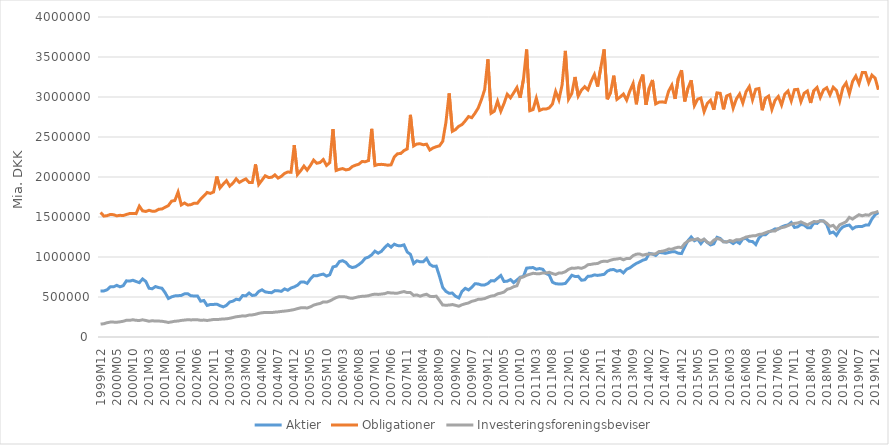
| Category | Aktier | Obligationer | Investeringsforeningsbeviser |
|---|---|---|---|
| 1999M12 | 575174 | 1557344 | 160748 |
| 2000M01 | 575647 | 1511391 | 165778 |
| 2000M02 | 590162 | 1516681 | 178351 |
| 2000M03 | 627205 | 1531792 | 186450 |
| 2000M04 | 627098 | 1528959 | 185941 |
| 2000M05 | 645738 | 1514125 | 184746 |
| 2000M06 | 627336 | 1521104 | 189451 |
| 2000M07 | 641242 | 1517881 | 196711 |
| 2000M08 | 702030 | 1531576 | 209725 |
| 2000M09 | 698497 | 1543590 | 208058 |
| 2000M10 | 709608 | 1545110 | 215514 |
| 2000M11 | 693340 | 1542126 | 208436 |
| 2000M12 | 679721 | 1635693 | 206347 |
| 2001M01 | 725587 | 1576917 | 214998 |
| 2001M02 | 694857 | 1569066 | 206745 |
| 2001M03 | 609401 | 1583968 | 196955 |
| 2001M04 | 603191 | 1572117 | 203492 |
| 2001M05 | 630929 | 1573534 | 198988 |
| 2001M06 | 617507 | 1596730 | 199211 |
| 2001M07 | 609553 | 1600137 | 196654 |
| 2001M08 | 553257 | 1622133 | 190230 |
| 2001M09 | 481246 | 1642834 | 181861 |
| 2001M10 | 501680 | 1698473 | 188909 |
| 2001M11 | 513948 | 1705760 | 196822 |
| 2001M12 | 516411 | 1811508 | 199644 |
| 2002M01 | 519822 | 1650899 | 207163 |
| 2002M02 | 539138 | 1675130 | 211558 |
| 2002M03 | 541132 | 1649367 | 216023 |
| 2002M04 | 514315 | 1654759 | 213580 |
| 2002M05 | 513817 | 1672767 | 215308 |
| 2002M06 | 513817 | 1672767 | 215308 |
| 2002M07 | 447539 | 1723382 | 208760 |
| 2002M08 | 456303 | 1762651 | 211579 |
| 2002M09 | 394395 | 1806730 | 206568 |
| 2002M10 | 406663 | 1795063 | 212548 |
| 2002M11 | 407258 | 1812469 | 219093 |
| 2002M12 | 410511 | 2006227 | 217309 |
| 2003M01 | 391549 | 1863047 | 221673 |
| 2003M02 | 376802 | 1911051 | 225702 |
| 2003M03 | 395690 | 1954134 | 227024 |
| 2003M04 | 437489 | 1886932 | 234152 |
| 2003M05 | 448094 | 1922970 | 242874 |
| 2003M06 | 472372 | 1977111 | 253018 |
| 2003M07 | 464487 | 1932479 | 257571 |
| 2003M08 | 518497 | 1955701 | 264121 |
| 2003M09 | 514394 | 1976613 | 263728 |
| 2003M10 | 549719 | 1932259 | 274176 |
| 2003M11 | 518793 | 1930731 | 276357 |
| 2003M12 | 524264 | 2157438 | 283847 |
| 2004M01 | 569517 | 1907331 | 295540 |
| 2004M02 | 590348 | 1960377 | 302996 |
| 2004M03 | 563873 | 2015258 | 306728 |
| 2004M04 | 557087 | 1994459 | 304884 |
| 2004M05 | 553644 | 1995813 | 305509 |
| 2004M06 | 579982 | 2026560 | 310671 |
| 2004M07 | 577582 | 1986508 | 314125 |
| 2004M08 | 570687 | 2008771 | 319660 |
| 2004M09 | 601262 | 2044870 | 323707 |
| 2004M10 | 584594 | 2062475 | 328383 |
| 2004M11 | 612471 | 2058625 | 335384 |
| 2004M12 | 626287 | 2399007 | 343144 |
| 2005M01 | 647568 | 2030789 | 354733 |
| 2005M02 | 686066 | 2079000 | 364640 |
| 2005M03 | 688607 | 2136473 | 366253 |
| 2005M04 | 670048 | 2086332 | 362498 |
| 2005M05 | 725046 | 2143882 | 376826 |
| 2005M06 | 767618 | 2211582 | 397766 |
| 2005M07 | 764645 | 2171839 | 410469 |
| 2005M08 | 777319 | 2181082 | 418972 |
| 2005M09 | 786332 | 2218467 | 438329 |
| 2005M10 | 761261 | 2144434 | 436105 |
| 2005M11 | 777998 | 2179472 | 450288 |
| 2005M12 | 876163 | 2599662 | 471850 |
| 2006M01 | 886363 | 2081826 | 492881 |
| 2006M02 | 943407 | 2096086 | 504632 |
| 2006M03 | 953835 | 2105200 | 502265 |
| 2006M04 | 932787 | 2088709 | 501263 |
| 2006M05 | 885160 | 2096140 | 487065 |
| 2006M06 | 868076 | 2130715 | 482889 |
| 2006M07 | 878239 | 2147943 | 493746 |
| 2006M08 | 904551 | 2159636 | 503033 |
| 2006M09 | 936797 | 2193171 | 508286 |
| 2006M10 | 984872 | 2191238 | 510813 |
| 2006M11 | 997962 | 2205316 | 516009 |
| 2006M12 | 1027930 | 2602178 | 528614 |
| 2007M01 | 1072939 | 2144428 | 535917 |
| 2007M02 | 1047612 | 2156160 | 532186 |
| 2007M03 | 1070763 | 2158080 | 536508 |
| 2007M04 | 1116896 | 2153997 | 541713 |
| 2007M05 | 1155385 | 2147554 | 555614 |
| 2007M06 | 1123217 | 2152316 | 550464 |
| 2007M07 | 1160422 | 2250769 | 548335 |
| 2007M08 | 1142552 | 2290712 | 547958 |
| 2007M09 | 1140519 | 2293926 | 558609 |
| 2007M10 | 1151802 | 2330081 | 568203 |
| 2007M11 | 1063171 | 2350492 | 555042 |
| 2007M12 | 1033177 | 2777086 | 555003 |
| 2008M01 | 918225 | 2388301 | 520054 |
| 2008M02 | 952377 | 2413171 | 526022 |
| 2008M03 | 940197 | 2415065 | 510069 |
| 2008M04 | 941535 | 2403112 | 524526 |
| 2008M05 | 982089 | 2410140 | 534425 |
| 2008M06 | 908343 | 2337160 | 508793 |
| 2008M07 | 883307 | 2362838 | 504650 |
| 2008M08 | 886096 | 2378275 | 510319 |
| 2008M09 | 759950 | 2389665 | 456584 |
| 2008M10 | 620008 | 2445823 | 399629 |
| 2008M11 | 570116 | 2683893 | 397576 |
| 2008M12 | 545871 | 3044262 | 398958 |
| 2009M01 | 549715 | 2571659 | 405919 |
| 2009M02 | 509245 | 2593509 | 395518 |
| 2009M03 | 488425 | 2634439 | 384809 |
| 2009M04 | 571307 | 2655599 | 403575 |
| 2009M05 | 608507 | 2702649 | 415678 |
| 2009M06 | 587808 | 2755471 | 425281 |
| 2009M07 | 620395 | 2741454 | 445444 |
| 2009M08 | 666249 | 2797081 | 455808 |
| 2009M09 | 662900 | 2862025 | 471255 |
| 2009M10 | 649205 | 2967408 | 473076 |
| 2009M11 | 650795 | 3091417 | 480443 |
| 2009M12 | 668987 | 3470399 | 497313 |
| 2010M01 | 704145 | 2797013 | 511840 |
| 2010M02 | 700775 | 2822479 | 517108 |
| 2010M03 | 734573 | 2947573 | 539561 |
| 2010M04 | 768999 | 2821624 | 548623 |
| 2010M05 | 693852 | 2919512 | 561939 |
| 2010M06 | 697532 | 3034452 | 597185 |
| 2010M07 | 717785 | 2989715 | 607574 |
| 2010M08 | 679719 | 3052346 | 628490 |
| 2010M09 | 711815 | 3118357 | 640203 |
| 2010M10 | 748166 | 2990379 | 739615 |
| 2010M11 | 755357 | 3214863 | 752164 |
| 2010M12 | 860927 | 3594134 | 771586 |
| 2011M01 | 865634 | 2827974 | 784306 |
| 2011M02 | 868103 | 2842919 | 796417 |
| 2011M03 | 846852 | 2985437 | 791657 |
| 2011M04 | 855641 | 2831028 | 790599 |
| 2011M05 | 846467 | 2849098 | 800536 |
| 2011M06 | 793880 | 2848803 | 799381 |
| 2011M07 | 776121 | 2864109 | 808539 |
| 2011M08 | 685664 | 2911356 | 793058 |
| 2011M09 | 666474 | 3069425 | 781106 |
| 2011M10 | 662567 | 2965332 | 800475 |
| 2011M11 | 663050 | 3152146 | 801234 |
| 2011M12 | 669523 | 3576010 | 816113 |
| 2012M01 | 718139 | 2973050 | 845524 |
| 2012M02 | 771891 | 3043339 | 861101 |
| 2012M03 | 756309 | 3250779 | 860080 |
| 2012M04 | 758267 | 3012721 | 866469 |
| 2012M05 | 709421 | 3086802 | 858201 |
| 2012M06 | 715047 | 3129053 | 874065 |
| 2012M07 | 759130 | 3089635 | 903626 |
| 2012M08 | 761567 | 3196643 | 908313 |
| 2012M09 | 776340 | 3280142 | 915947 |
| 2012M10 | 769931 | 3130351 | 918047 |
| 2012M11 | 776180 | 3372924 | 939726 |
| 2012M12 | 783027 | 3594865 | 948097 |
| 2013M01 | 822643 | 2971794 | 944493 |
| 2013M02 | 840966 | 3055002 | 959815 |
| 2013M03 | 843061 | 3266687 | 970768 |
| 2013M04 | 823083 | 2970608 | 974951 |
| 2013M05 | 832404 | 3000721 | 982733 |
| 2013M06 | 801438 | 3037018 | 964751 |
| 2013M07 | 847509 | 2961347 | 981962 |
| 2013M08 | 864162 | 3076403 | 981785 |
| 2013M09 | 894095 | 3168318 | 1017385 |
| 2013M10 | 919727 | 2908692 | 1035193 |
| 2013M11 | 938002 | 3173965 | 1038076 |
| 2013M12 | 960100 | 3280446 | 1022521 |
| 2014M01 | 972051 | 2901676 | 1033038 |
| 2014M02 | 1045250 | 3113336 | 1038806 |
| 2014M03 | 1036700 | 3212970 | 1035572 |
| 2014M04 | 1019324 | 2913924 | 1040537 |
| 2014M05 | 1056345 | 2935294 | 1067899 |
| 2014M06 | 1053268 | 2939289 | 1071309 |
| 2014M07 | 1045577 | 2931923 | 1082399 |
| 2014M08 | 1055727 | 3072485 | 1099020 |
| 2014M09 | 1064387 | 3147346 | 1097512 |
| 2014M10 | 1065062 | 2976149 | 1112138 |
| 2014M11 | 1047105 | 3233681 | 1122770 |
| 2014M12 | 1042846 | 3335104 | 1117579 |
| 2015M01 | 1127106 | 2944162 | 1168416 |
| 2015M02 | 1204008 | 3110563 | 1198616 |
| 2015M03 | 1250650 | 3209223 | 1214989 |
| 2015M04 | 1203383 | 2893858 | 1217483 |
| 2015M05 | 1222973 | 2972672 | 1227671 |
| 2015M06 | 1167167 | 2987107 | 1204045 |
| 2015M07 | 1217273 | 2816092 | 1222869 |
| 2015M08 | 1180886 | 2920478 | 1183209 |
| 2015M09 | 1150968 | 2959819 | 1168840 |
| 2015M10 | 1164772 | 2840932 | 1209796 |
| 2015M11 | 1246261 | 3051786 | 1230392 |
| 2015M12 | 1231384 | 3045899 | 1221305 |
| 2016M01 | 1189395 | 2845990 | 1190360 |
| 2016M02 | 1188901 | 3013158 | 1186317 |
| 2016M03 | 1194812 | 3031239 | 1206339 |
| 2016M04 | 1167867 | 2860692 | 1194605 |
| 2016M05 | 1195364 | 2975857 | 1216550 |
| 2016M06 | 1169180 | 3037508 | 1214723 |
| 2016M07 | 1226644 | 2924713 | 1230825 |
| 2016M08 | 1232244 | 3066071 | 1249459 |
| 2016M09 | 1196029 | 3129698 | 1257885 |
| 2016M10 | 1194275 | 2965309 | 1264519 |
| 2016M11 | 1155665 | 3096966 | 1266793 |
| 2016M12 | 1238726 | 3106073 | 1282391 |
| 2017M01 | 1278458 | 2834637 | 1286855 |
| 2017M02 | 1276900 | 2985265 | 1303039 |
| 2017M03 | 1312374 | 3011967 | 1317878 |
| 2017M04 | 1329143 | 2844019 | 1325039 |
| 2017M05 | 1351844 | 2960135 | 1324912 |
| 2017M06 | 1349249 | 3006472 | 1355345 |
| 2017M07 | 1375716 | 2899525 | 1366734 |
| 2017M08 | 1392160 | 3034719 | 1375628 |
| 2017M09 | 1400591 | 3074375 | 1392275 |
| 2017M10 | 1431720 | 2950935 | 1410574 |
| 2017M11 | 1369476 | 3092092 | 1420188 |
| 2017M12 | 1376869 | 3095680 | 1425073 |
| 2018M01 | 1406604 | 2941743 | 1439456 |
| 2018M02 | 1398933 | 3047262 | 1419158 |
| 2018M03 | 1366812 | 3075427 | 1400585 |
| 2018M04 | 1365400 | 2925404 | 1421699 |
| 2018M05 | 1424982 | 3078910 | 1442811 |
| 2018M06 | 1419996 | 3118906 | 1441204 |
| 2018M07 | 1454308 | 2994861 | 1451038 |
| 2018M08 | 1450031 | 3089103 | 1448643 |
| 2018M09 | 1404820 | 3115835 | 1421857 |
| 2018M10 | 1297964 | 3026541 | 1383382 |
| 2018M11 | 1311921 | 3121768 | 1395676 |
| 2018M12 | 1271181 | 3083701 | 1348898 |
| 2019M01 | 1334679 | 2948800 | 1402900 |
| 2019M02 | 1375506 | 3117031 | 1420935 |
| 2019M03 | 1391861 | 3176619 | 1441173 |
| 2019M04 | 1399462 | 3039193 | 1494850 |
| 2019M05 | 1352543 | 3194209 | 1474360 |
| 2019M06 | 1376666 | 3262055 | 1502655 |
| 2019M07 | 1381825 | 3165185 | 1528761 |
| 2019M08 | 1382172 | 3304850 | 1514939 |
| 2019M09 | 1398976 | 3304755 | 1527492 |
| 2019M10 | 1399424 | 3177553 | 1522230 |
| 2019M11 | 1475615 | 3273178 | 1548142 |
| 2019M12 | 1529486 | 3235372 | 1556118 |
| 2020M01 | 1553589 | 3090412 | 1571614 |